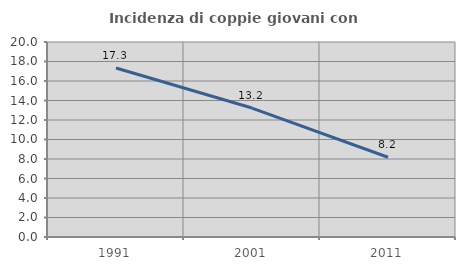
| Category | Incidenza di coppie giovani con figli |
|---|---|
| 1991.0 | 17.33 |
| 2001.0 | 13.225 |
| 2011.0 | 8.177 |